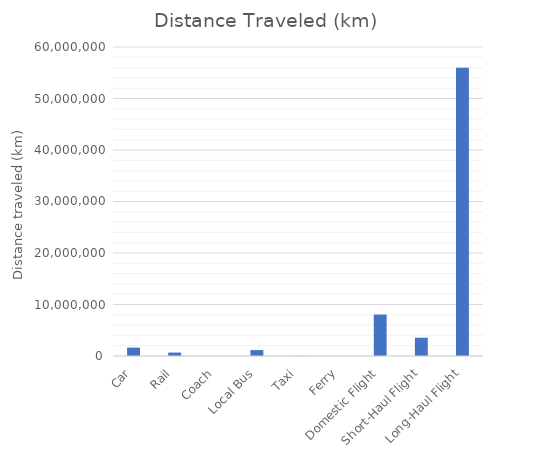
| Category | Distance Traveled (km) |
|---|---|
| Car | 1624019.709 |
| Rail | 667838.128 |
| Coach | 0 |
| Local Bus | 1150370.314 |
| Taxi | 33785.1 |
| Ferry | 0 |
| Domestic Flight | 8050657.79 |
| Short-Haul Flight | 3546143.12 |
| Long-Haul Flight | 55993754.16 |